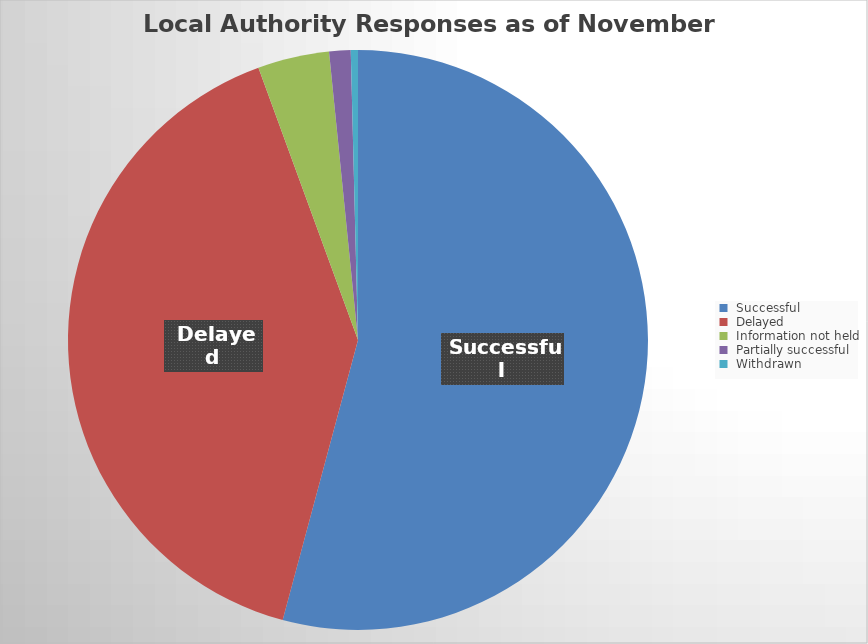
| Category | Series 0 |
|---|---|
|  Successful | 136 |
|  Delayed | 101 |
|  Information not held | 10 |
|  Partially successful | 3 |
|  Withdrawn | 1 |